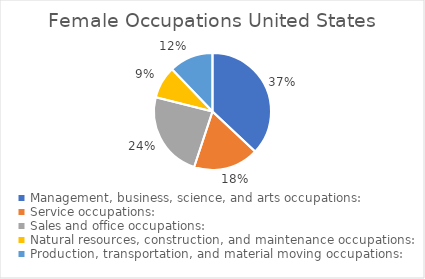
| Category | Series 0 | Series 1 | Series 2 |
|---|---|---|---|
| Management, business, science, and arts occupations: | 54751318 | 26076937 | 28674381 |
| Service occupations: | 26765182 | 11671822 | 15093360 |
| Sales and office occupations: | 35282759 | 13390245 | 21892514 |
| Natural resources, construction, and maintenance occupations: | 13171632 | 12557783 | 613849 |
| Production, transportation, and material moving occupations: | 18030435 | 14035804 | 3994631 |